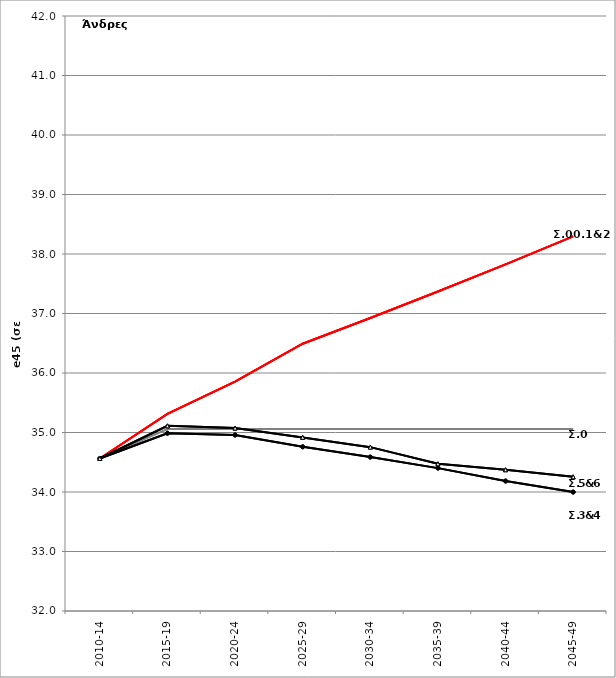
| Category | Σ0.e45 | Σ00.e45 | Σ1.e45 | Σ2.e45 | Σ3.e45 | Σ4.e45 | Σ5.e45 | Σ6.e45 |
|---|---|---|---|---|---|---|---|---|
| 2010-14 | 34.563 | 34.563 | 34.563 | 34.563 | 34.563 | 34.563 | 34.563 | 34.563 |
| 2015-19 | 35.058 | 35.314 | 35.314 | 35.314 | 34.988 | 34.988 | 35.112 | 35.112 |
| 2020-24 | 35.058 | 35.856 | 35.856 | 35.856 | 34.958 | 34.958 | 35.074 | 35.074 |
| 2025-29 | 35.058 | 36.492 | 36.492 | 36.492 | 34.759 | 34.759 | 34.918 | 34.918 |
| 2030-34 | 35.058 | 36.925 | 36.925 | 36.925 | 34.587 | 34.587 | 34.754 | 34.754 |
| 2035-39 | 35.058 | 37.369 | 37.369 | 37.369 | 34.401 | 34.401 | 34.474 | 34.474 |
| 2040-44 | 35.058 | 37.826 | 37.826 | 37.826 | 34.184 | 34.184 | 34.374 | 34.374 |
| 2045-49 | 35.058 | 38.296 | 38.296 | 38.296 | 33.999 | 33.999 | 34.255 | 34.255 |